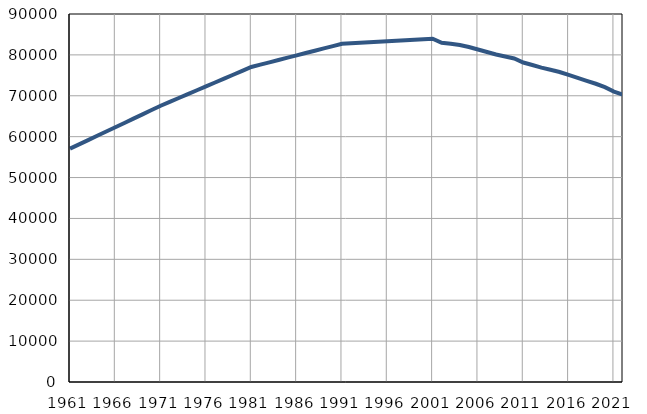
| Category | Број
становника |
|---|---|
| 1961.0 | 57062 |
| 1962.0 | 58111 |
| 1963.0 | 59161 |
| 1964.0 | 60210 |
| 1965.0 | 61259 |
| 1966.0 | 62309 |
| 1967.0 | 63358 |
| 1968.0 | 64407 |
| 1969.0 | 65456 |
| 1970.0 | 66506 |
| 1971.0 | 67555 |
| 1972.0 | 68504 |
| 1973.0 | 69454 |
| 1974.0 | 70403 |
| 1975.0 | 71353 |
| 1976.0 | 72302 |
| 1977.0 | 73251 |
| 1978.0 | 74201 |
| 1979.0 | 75151 |
| 1980.0 | 76100 |
| 1981.0 | 77049 |
| 1982.0 | 77616 |
| 1983.0 | 78184 |
| 1984.0 | 78751 |
| 1985.0 | 79319 |
| 1986.0 | 79886 |
| 1987.0 | 80453 |
| 1988.0 | 81021 |
| 1989.0 | 81588 |
| 1990.0 | 82156 |
| 1991.0 | 82723 |
| 1992.0 | 82847 |
| 1993.0 | 82971 |
| 1994.0 | 83095 |
| 1995.0 | 83219 |
| 1996.0 | 83343 |
| 1997.0 | 83466 |
| 1998.0 | 83590 |
| 1999.0 | 83714 |
| 2000.0 | 83838 |
| 2001.0 | 83962 |
| 2002.0 | 82968 |
| 2003.0 | 82730 |
| 2004.0 | 82417 |
| 2005.0 | 81923 |
| 2006.0 | 81323 |
| 2007.0 | 80700 |
| 2008.0 | 80087 |
| 2009.0 | 79601 |
| 2010.0 | 79133 |
| 2011.0 | 78141 |
| 2012.0 | 77528 |
| 2013.0 | 76886 |
| 2014.0 | 76364 |
| 2015.0 | 75805 |
| 2016.0 | 75097 |
| 2017.0 | 74371 |
| 2018.0 | 73667 |
| 2019.0 | 72940 |
| 2020.0 | 72096 |
| 2021.0 | 71039 |
| 2022.0 | 70270 |